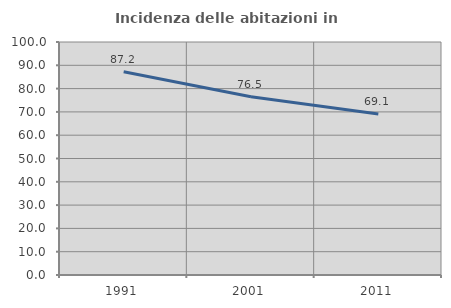
| Category | Incidenza delle abitazioni in proprietà  |
|---|---|
| 1991.0 | 87.242 |
| 2001.0 | 76.543 |
| 2011.0 | 69.13 |